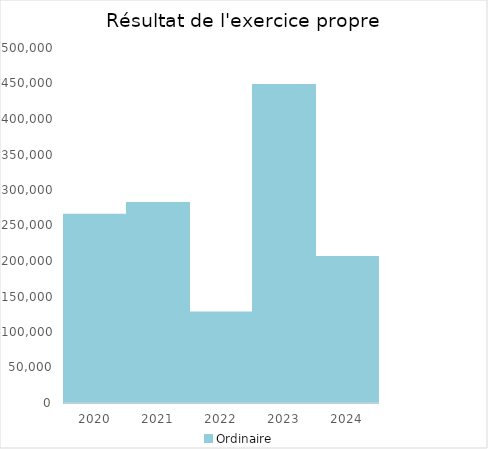
| Category |   | Ordinaire |    |
|---|---|---|---|
| 2020.0 |  | 265266.69 |  |
| 2021.0 |  | 281800.44 |  |
| 2022.0 |  | 127530.74 |  |
| 2023.0 |  | 447838.73 |  |
| 2024.0 |  | 205493.74 |  |